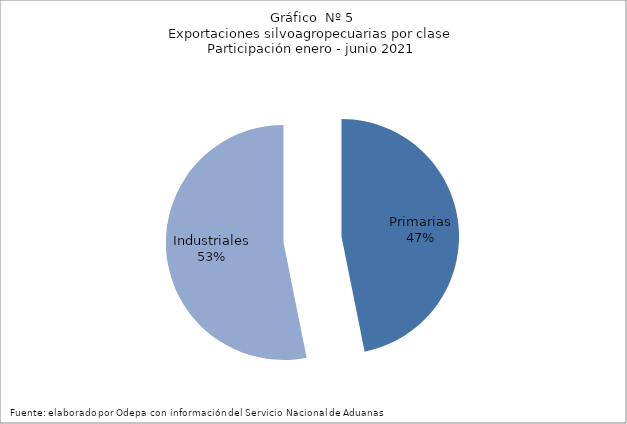
| Category | Series 0 |
|---|---|
| Primarias | 4278417 |
| Industriales | 4854771 |